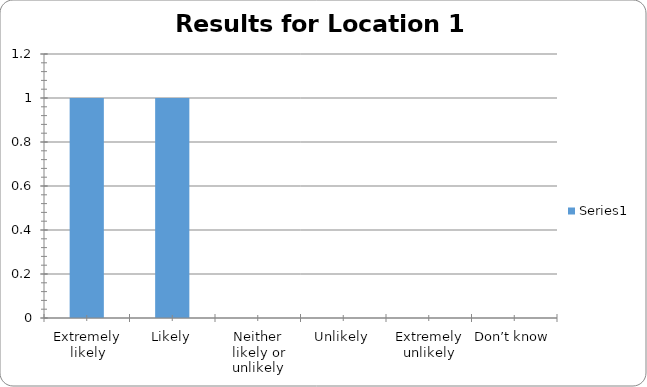
| Category | Series 0 |
|---|---|
| Extremely likely | 1 |
| Likely | 1 |
| Neither likely or unlikely | 0 |
| Unlikely | 0 |
| Extremely unlikely | 0 |
| Don’t know | 0 |